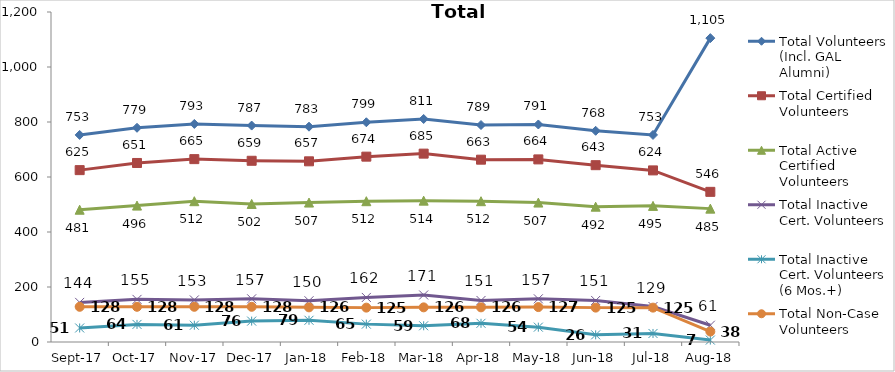
| Category | Total Volunteers (Incl. GAL Alumni) | Total Certified Volunteers | Total Active Certified Volunteers | Total Inactive Cert. Volunteers | Total Inactive Cert. Volunteers (6 Mos.+) | Total Non-Case Volunteers |
|---|---|---|---|---|---|---|
| 2017-09-01 | 753 | 625 | 481 | 144 | 51 | 128 |
| 2017-10-01 | 779 | 651 | 496 | 155 | 64 | 128 |
| 2017-11-01 | 793 | 665 | 512 | 153 | 61 | 128 |
| 2017-12-01 | 787 | 659 | 502 | 157 | 76 | 128 |
| 2018-01-01 | 783 | 657 | 507 | 150 | 79 | 126 |
| 2018-02-01 | 799 | 674 | 512 | 162 | 65 | 125 |
| 2018-03-01 | 811 | 685 | 514 | 171 | 59 | 126 |
| 2018-04-01 | 789 | 663 | 512 | 151 | 68 | 126 |
| 2018-05-01 | 791 | 664 | 507 | 157 | 54 | 127 |
| 2018-06-01 | 768 | 643 | 492 | 151 | 26 | 125 |
| 2018-07-01 | 753 | 624 | 495 | 129 | 31 | 125 |
| 2018-08-01 | 1105 | 546 | 485 | 61 | 7 | 38 |